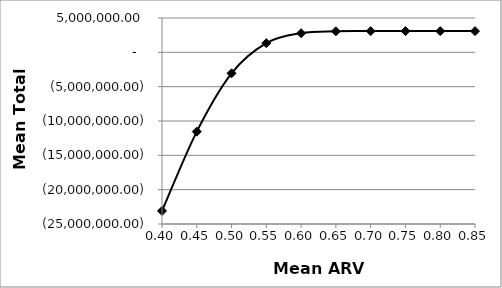
| Category | Series 0 |
|---|---|
| 0.4 | -23099305 |
| 0.45 | -11545959 |
| 0.5 | -3056270 |
| 0.55 | 1337784 |
| 0.6 | 2787623 |
| 0.65 | 3064006 |
| 0.7 | 3089093 |
| 0.75 | 3090839 |
| 0.8 | 3090839 |
| 0.85 | 3090839 |